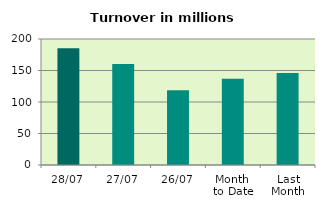
| Category | Series 0 |
|---|---|
| 28/07 | 185.503 |
| 27/07 | 160.169 |
| 26/07 | 118.608 |
| Month 
to Date | 136.715 |
| Last
Month | 145.879 |